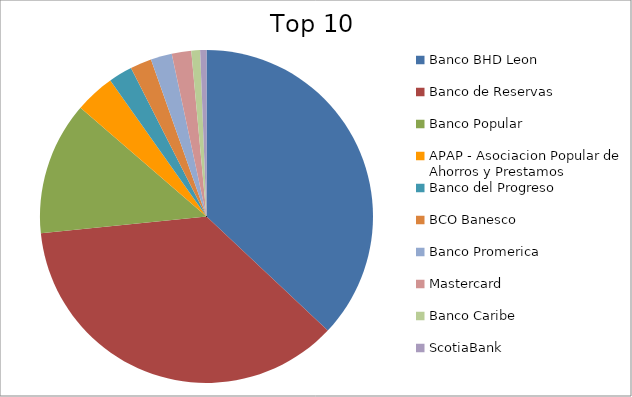
| Category | Series 0 |
|---|---|
| Banco BHD Leon | 37.01 |
| Banco de Reservas | 36.37 |
| Banco Popular | 12.94 |
| APAP - Asociacion Popular de Ahorros y Prestamos | 3.86 |
| Banco del Progreso | 2.31 |
| BCO Banesco | 2.08 |
| Banco Promerica | 2.06 |
| Mastercard | 1.89 |
| Banco Caribe | 0.85 |
| ScotiaBank | 0.61 |